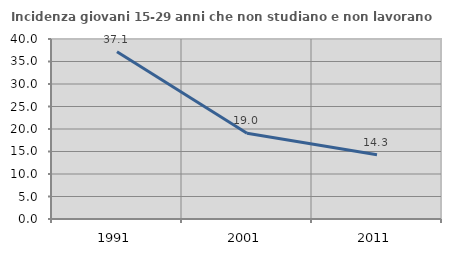
| Category | Incidenza giovani 15-29 anni che non studiano e non lavorano  |
|---|---|
| 1991.0 | 37.144 |
| 2001.0 | 19.048 |
| 2011.0 | 14.286 |